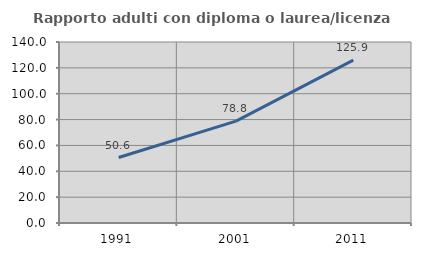
| Category | Rapporto adulti con diploma o laurea/licenza media  |
|---|---|
| 1991.0 | 50.646 |
| 2001.0 | 78.764 |
| 2011.0 | 125.925 |